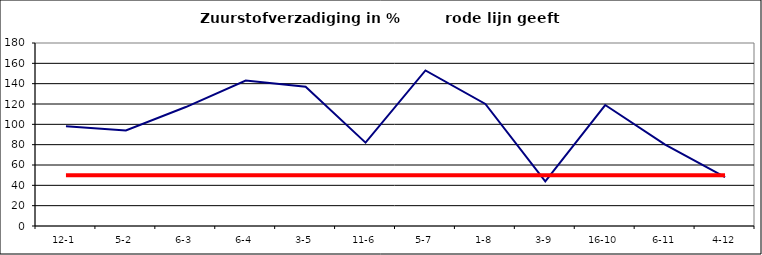
| Category | Series 0 | Series 1 |
|---|---|---|
| 12-1 | 98 | 50 |
| 5-2 | 94 | 50 |
| 6-3 | 117 | 50 |
| 6-4 | 143 | 50 |
| 3-5 | 137 | 50 |
| 11-6 | 82 | 50 |
| 5-7 | 153 | 50 |
| 1-8 | 120 | 50 |
| 3-9 | 44 | 50 |
| 16-10 | 119 | 50 |
| 6-11 | 80 | 50 |
| 4-12 | 48 | 50 |